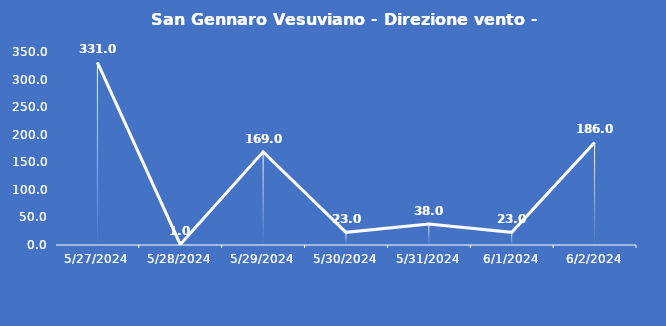
| Category | San Gennaro Vesuviano - Direzione vento - Grezzo (°N) |
|---|---|
| 5/27/24 | 331 |
| 5/28/24 | 1 |
| 5/29/24 | 169 |
| 5/30/24 | 23 |
| 5/31/24 | 38 |
| 6/1/24 | 23 |
| 6/2/24 | 186 |